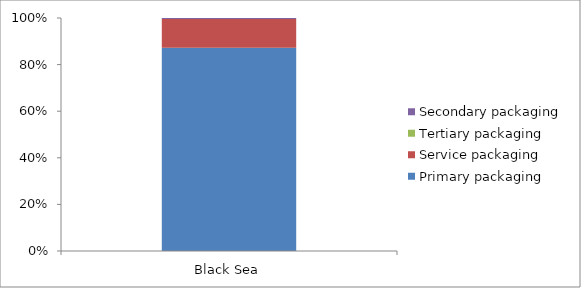
| Category | Primary packaging | Service packaging | Tertiary packaging | Secondary packaging |
|---|---|---|---|---|
| Black Sea | 2335 | 329 | 0 | 12 |